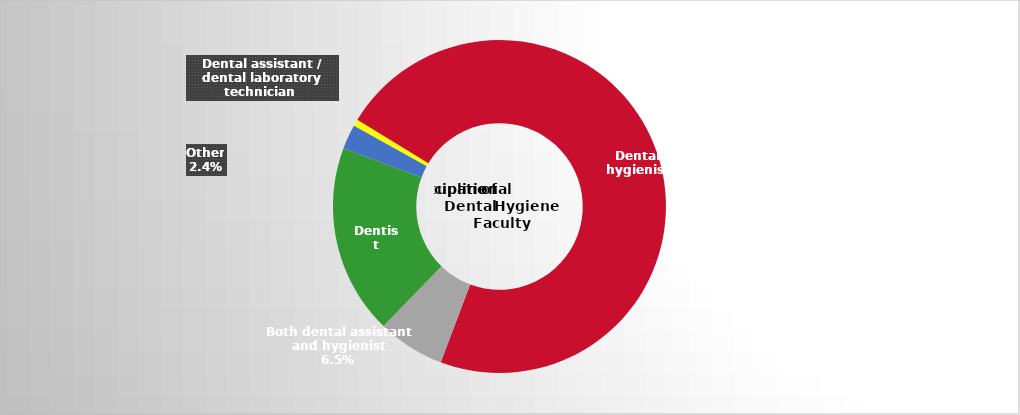
| Category | Series 2 |
|---|---|
| Dental assistant / dental laboratory technician  | 0.007 |
| Dental hygienist | 0.72 |
| Both dental assistant and hygienist | 0.065 |
| Dentist | 0.184 |
| Other | 0.024 |